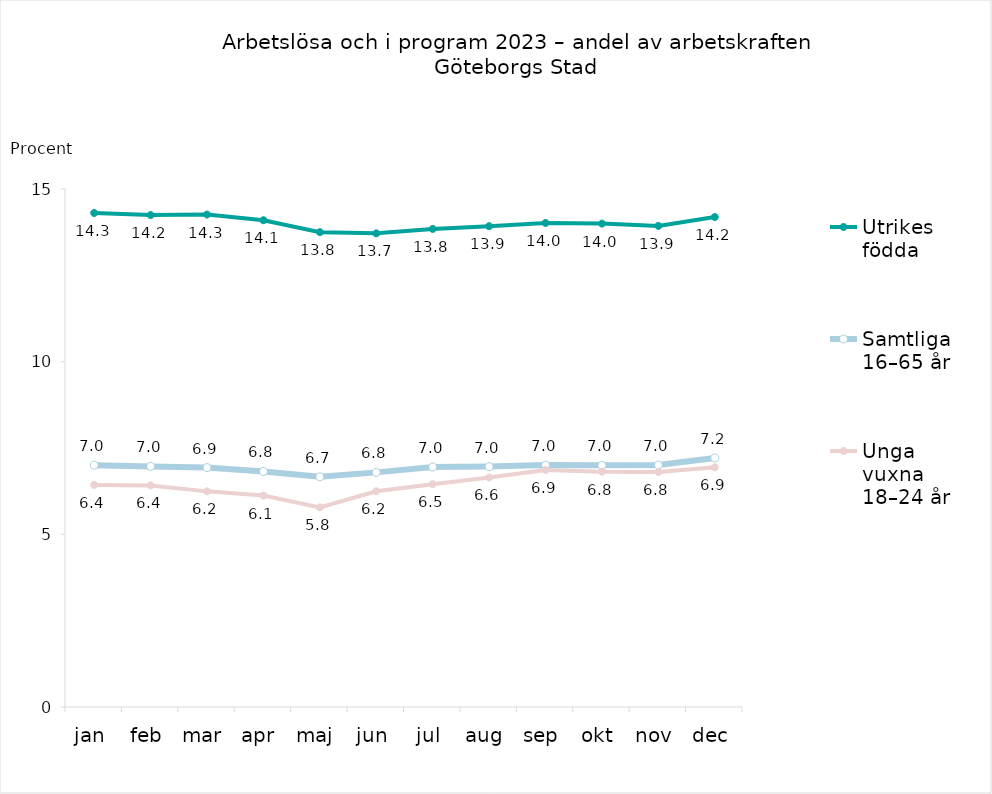
| Category | Utrikes födda | Samtliga 16–65 år | Unga vuxna 18–24 år |
|---|---|---|---|
| jan | 14.305 | 7.002 | 6.432 |
| feb | 14.245 | 6.967 | 6.417 |
| mar | 14.26 | 6.932 | 6.244 |
| apr | 14.096 | 6.82 | 6.123 |
| maj | 13.75 | 6.666 | 5.781 |
| jun | 13.715 | 6.794 | 6.247 |
| jul | 13.845 | 6.951 | 6.453 |
| aug | 13.924 | 6.961 | 6.646 |
| sep | 14.017 | 7.006 | 6.865 |
| okt | 13.998 | 6.998 | 6.814 |
| nov | 13.932 | 7.006 | 6.805 |
| dec | 14.188 | 7.211 | 6.94 |